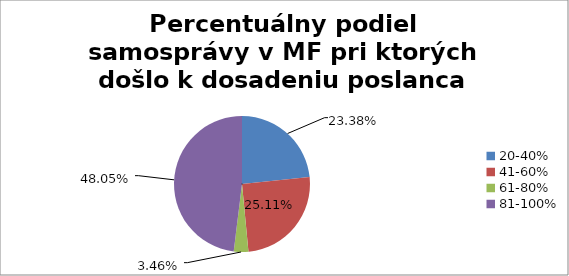
| Category | Percentuálny podiel samosprávy v MF pri ktorých došlo k dosadeniu poslanca |
|---|---|
| 20-40% | 0.234 |
| 41-60% | 0.251 |
| 61-80% | 0.035 |
| 81-100% | 0.481 |